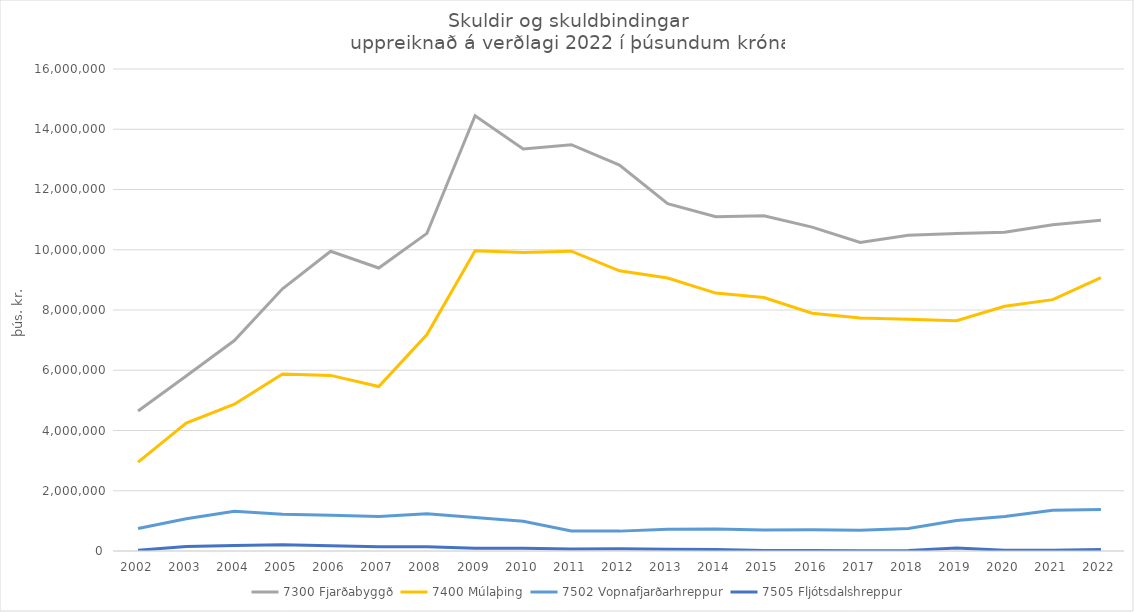
| Category | 7300 Fjarðabyggð | 7400 Múlaþing | 7502 Vopnafjarðarhreppur | 7505 Fljótsdalshreppur |
|---|---|---|---|---|
| 2002.0 | 4645518.023 | 2949199.147 | 747066.162 | 24659.286 |
| 2003.0 | 5811372.733 | 4249484.968 | 1067913.971 | 149265.791 |
| 2004.0 | 6985907.265 | 4873946.824 | 1316734.824 | 185861.441 |
| 2005.0 | 8704639.596 | 5877832.728 | 1220452.326 | 209822.188 |
| 2006.0 | 9948855.208 | 5828850.937 | 1187698.853 | 172658.229 |
| 2007.0 | 9395102.218 | 5461455.882 | 1147189.538 | 137818.487 |
| 2008.0 | 10544634.424 | 7185167.357 | 1234652.386 | 137918.981 |
| 2009.0 | 14450567.781 | 9963170.442 | 1109770.45 | 88906.981 |
| 2010.0 | 13348594.002 | 9912124.214 | 985001.103 | 94960.262 |
| 2011.0 | 13485720.601 | 9951895.174 | 663720.226 | 63473.77 |
| 2012.0 | 12812263.367 | 9302155.51 | 659756.221 | 71270.487 |
| 2013.0 | 11527993.263 | 9061535.296 | 718104.2 | 60180.255 |
| 2014.0 | 11095834.764 | 8561535.288 | 726806.904 | 50032.439 |
| 2015.0 | 11130749.687 | 8414093.552 | 694215.416 | 18980.433 |
| 2016.0 | 10751165.207 | 7890629.925 | 707013.358 | 20521.706 |
| 2017.0 | 10242177.983 | 7736500.94 | 686627.894 | 9265.47 |
| 2018.0 | 10483513.498 | 7693714.95 | 750364.668 | 20048.126 |
| 2019.0 | 10540912.545 | 7642093.778 | 1011834.023 | 96746.526 |
| 2020.0 | 10580417.016 | 8126062.131 | 1145077.623 | 23499.59 |
| 2021.0 | 10830134.094 | 8343895.412 | 1350146.526 | 26494.698 |
| 2022.0 | 10982751 | 9071124 | 1375550 | 50972 |